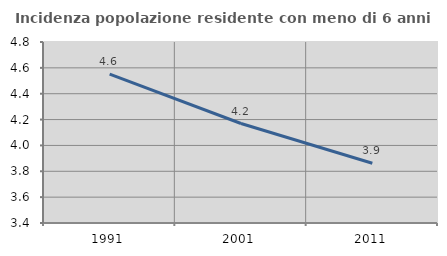
| Category | Incidenza popolazione residente con meno di 6 anni |
|---|---|
| 1991.0 | 4.551 |
| 2001.0 | 4.169 |
| 2011.0 | 3.862 |